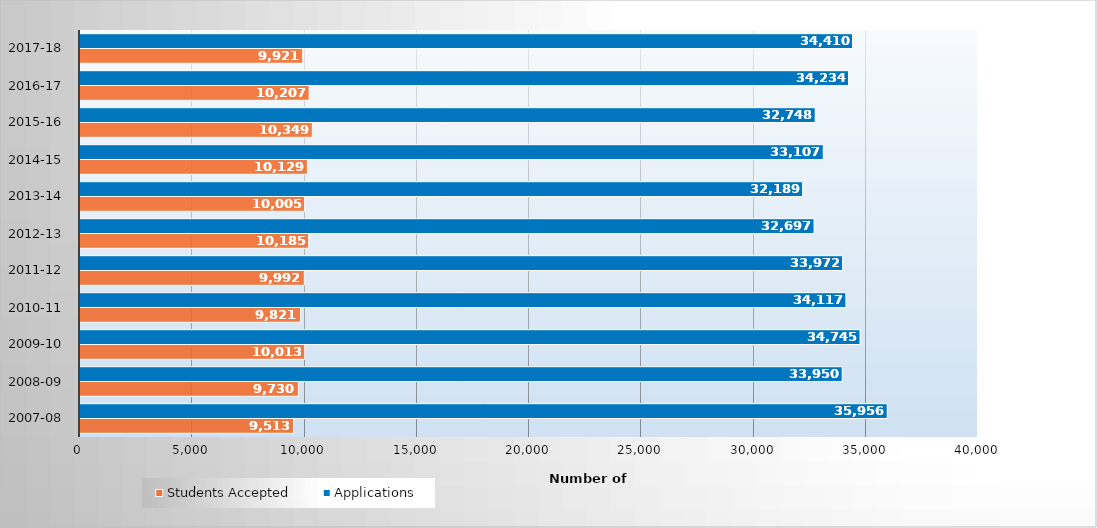
| Category | Students Accepted | Applications |
|---|---|---|
| 2007-08 | 9513 | 35956 |
| 2008-09 | 9730 | 33950 |
| 2009-10 | 10013 | 34745 |
| 2010-11 | 9821 | 34117 |
| 2011-12 | 9992 | 33972 |
| 2012-13 | 10185 | 32697 |
| 2013-14 | 10005 | 32189 |
| 2014-15 | 10129 | 33107 |
| 2015-16 | 10349 | 32748 |
| 2016-17 | 10207 | 34234 |
| 2017-18 | 9921 | 34410 |